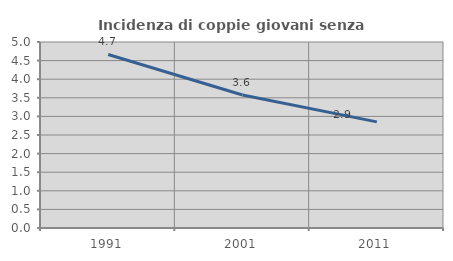
| Category | Incidenza di coppie giovani senza figli |
|---|---|
| 1991.0 | 4.665 |
| 2001.0 | 3.577 |
| 2011.0 | 2.853 |